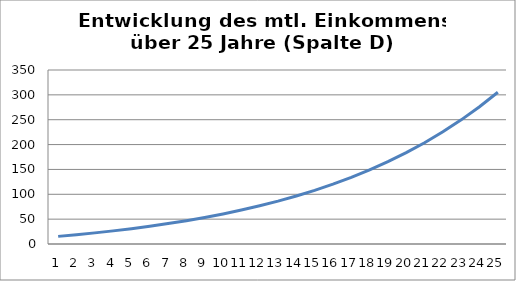
| Category | Series 0 |
|---|---|
| 0 | 15.339 |
| 1 | 18.689 |
| 2 | 22.368 |
| 3 | 26.41 |
| 4 | 30.85 |
| 5 | 35.726 |
| 6 | 41.082 |
| 7 | 46.966 |
| 8 | 53.428 |
| 9 | 60.526 |
| 10 | 68.323 |
| 11 | 76.887 |
| 12 | 86.294 |
| 13 | 96.626 |
| 14 | 107.976 |
| 15 | 120.442 |
| 16 | 134.135 |
| 17 | 149.175 |
| 18 | 165.695 |
| 19 | 183.842 |
| 20 | 203.773 |
| 21 | 225.666 |
| 22 | 249.714 |
| 23 | 276.128 |
| 24 | 305.142 |